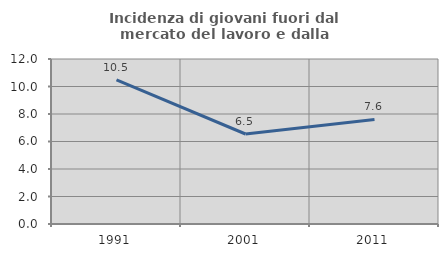
| Category | Incidenza di giovani fuori dal mercato del lavoro e dalla formazione  |
|---|---|
| 1991.0 | 10.481 |
| 2001.0 | 6.545 |
| 2011.0 | 7.607 |